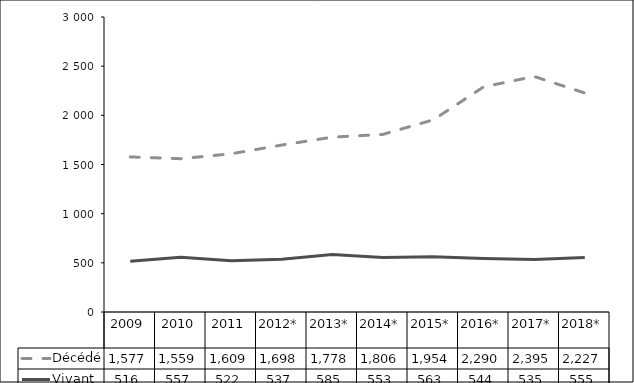
| Category | Décédé | Vivant |
|---|---|---|
| 2009 | 1577 | 516 |
| 2010 | 1559 | 557 |
| 2011 | 1609 | 522 |
| 2012* | 1698 | 537 |
| 2013* | 1778 | 585 |
| 2014* | 1806 | 553 |
| 2015* | 1954 | 563 |
| 2016* | 2290 | 544 |
| 2017* | 2395 | 535 |
| 2018* | 2227 | 555 |